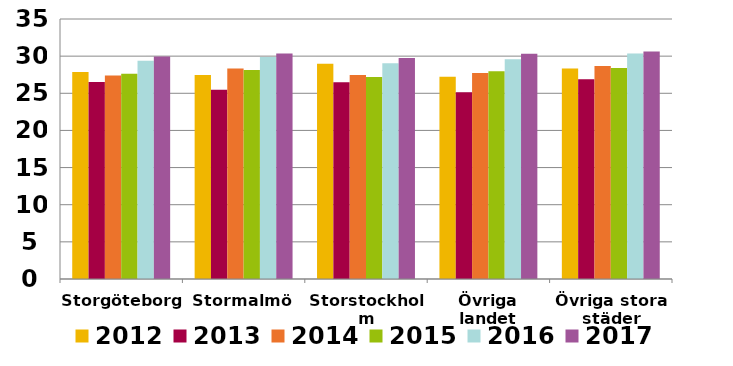
| Category | 2012 | 2013 | 2014 | 2015 | 2016 | 2017 |
|---|---|---|---|---|---|---|
| Storgöteborg | 27.849 | 26.528 | 27.394 | 27.619 | 29.39 | 29.949 |
| Stormalmö | 27.47 | 25.482 | 28.32 | 28.138 | 29.89 | 30.367 |
| Storstockholm | 28.967 | 26.482 | 27.462 | 27.189 | 29.058 | 29.757 |
| Övriga landet | 27.21 | 25.131 | 27.728 | 27.978 | 29.569 | 30.314 |
| Övriga stora städer | 28.345 | 26.892 | 28.673 | 28.415 | 30.36 | 30.627 |